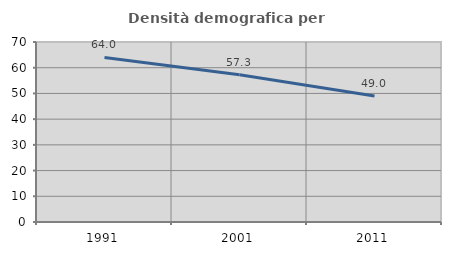
| Category | Densità demografica |
|---|---|
| 1991.0 | 63.973 |
| 2001.0 | 57.293 |
| 2011.0 | 48.977 |